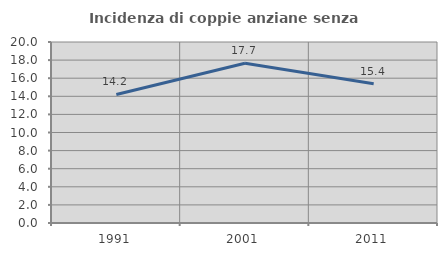
| Category | Incidenza di coppie anziane senza figli  |
|---|---|
| 1991.0 | 14.203 |
| 2001.0 | 17.654 |
| 2011.0 | 15.394 |